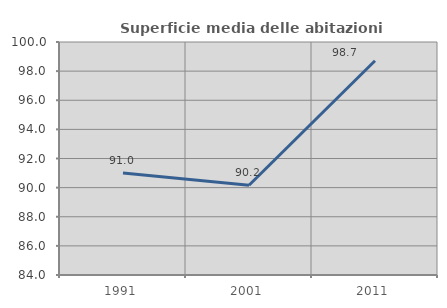
| Category | Superficie media delle abitazioni occupate |
|---|---|
| 1991.0 | 91 |
| 2001.0 | 90.167 |
| 2011.0 | 98.716 |